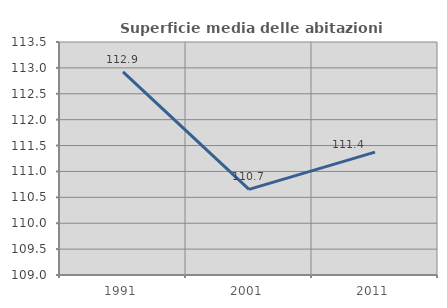
| Category | Superficie media delle abitazioni occupate |
|---|---|
| 1991.0 | 112.924 |
| 2001.0 | 110.653 |
| 2011.0 | 111.373 |